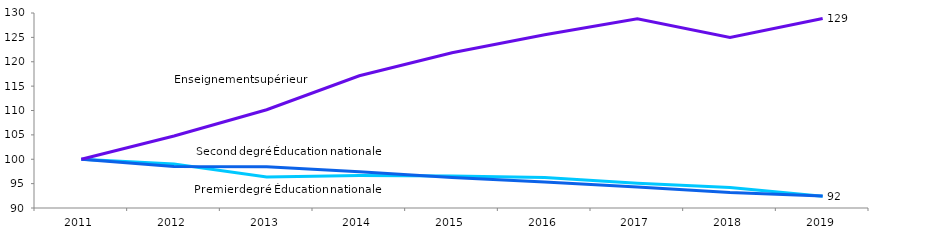
| Category | Premier degré Éducation nationale | Second degré Éducation nationale | Enseignement supérieur |
|---|---|---|---|
| 2011.0 | 100 | 100 | 100 |
| 2012.0 | 99.014 | 98.525 | 104.767 |
| 2013.0 | 96.382 | 98.475 | 110.156 |
| 2014.0 | 96.679 | 97.43 | 117.135 |
| 2015.0 | 96.579 | 96.232 | 121.851 |
| 2016.0 | 96.254 | 95.33 | 125.524 |
| 2017.0 | 95.071 | 94.289 | 128.791 |
| 2018.0 | 94.227 | 93.157 | 124.978 |
| 2019.0 | 92.404 | 92.446 | 128.855 |